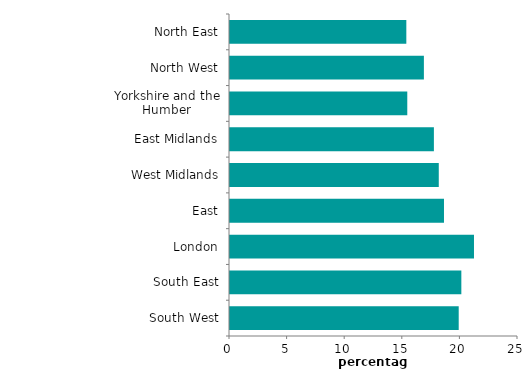
| Category | 2017-18 |
|---|---|
| North East | 15.306 |
| North West | 16.831 |
| Yorkshire and the Humber | 15.389 |
| East Midlands | 17.699 |
| West Midlands | 18.123 |
| East | 18.575 |
| London | 21.179 |
| South East | 20.082 |
| South West | 19.853 |